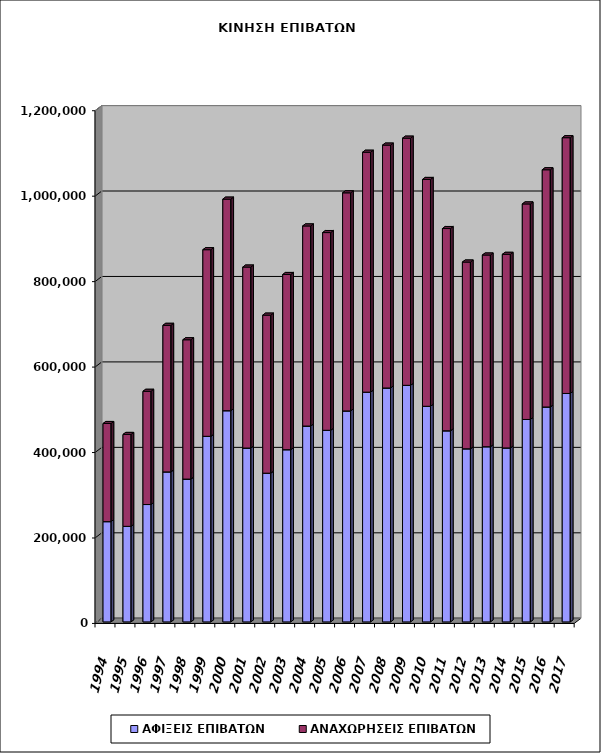
| Category | ΑΦΙΞΕΙΣ ΕΠΙΒΑΤΩΝ | ΑΝΑΧΩΡΗΣΕΙΣ ΕΠΙΒΑΤΩΝ |
|---|---|---|
| 1994.0 | 234655 | 229642 |
| 1995.0 | 223649 | 215067 |
| 1996.0 | 274682 | 265003 |
| 1997.0 | 351085 | 342985 |
| 1998.0 | 334247 | 326077 |
| 1999.0 | 434343 | 436757 |
| 2000.0 | 494317 | 495079 |
| 2001.0 | 406885 | 423563 |
| 2002.0 | 348053 | 369881 |
| 2003.0 | 403032 | 410025 |
| 2004.0 | 458373 | 468323 |
| 2005.0 | 448461 | 462746 |
| 2006.0 | 493760 | 510463 |
| 2007.0 | 537718 | 561478 |
| 2008.0 | 547484 | 568439 |
| 2009.0 | 553679 | 578455 |
| 2010.0 | 504633 | 530860 |
| 2011.0 | 447279 | 473357 |
| 2012.0 | 405104 | 437104 |
| 2013.0 | 409981 | 448668 |
| 2014.0 | 407162 | 453081 |
| 2015.0 | 473771 | 504426 |
| 2016.0 | 503021 | 555196 |
| 2017.0 | 534647 | 598621 |